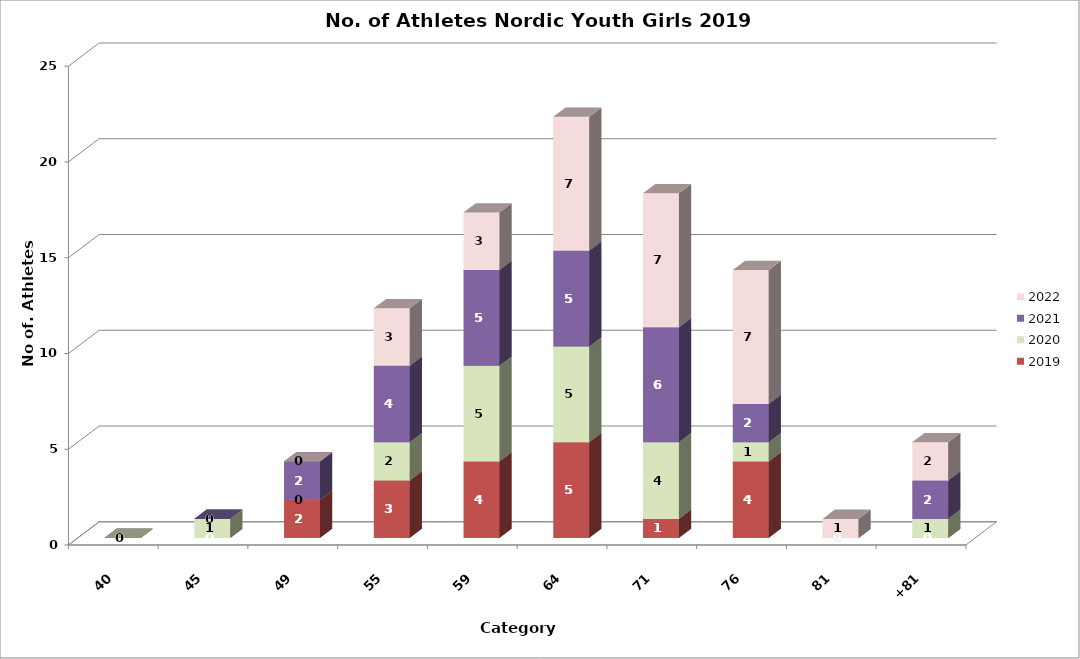
| Category | 2019 | 2020 | 2021 | 2022 |
|---|---|---|---|---|
| 40 | 0 | 0 | 0 | 0 |
| 45 | 0 | 1 | 0 | 0 |
| 49 | 2 | 0 | 2 | 0 |
| 55 | 3 | 2 | 4 | 3 |
| 59 | 4 | 5 | 5 | 3 |
| 64 | 5 | 5 | 5 | 7 |
| 71 | 1 | 4 | 6 | 7 |
| 76 | 4 | 1 | 2 | 7 |
| 81 | 0 | 0 | 0 | 1 |
| +81 | 0 | 1 | 2 | 2 |